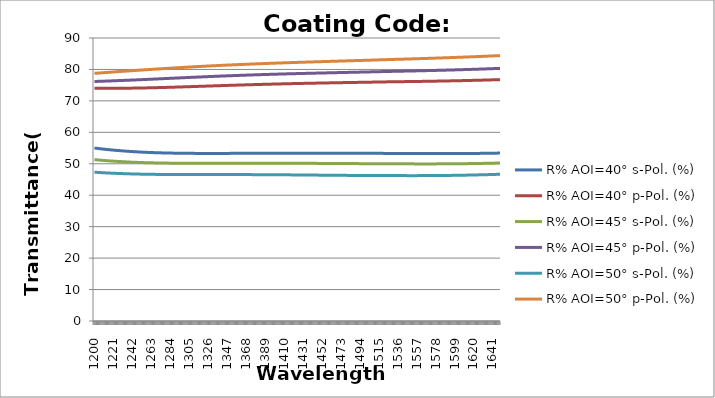
| Category | R% AOI=40° s-Pol. (%) | R% AOI=40° p-Pol. (%) | R% AOI=45° s-Pol. (%) | R% AOI=45° p-Pol. (%) | R% AOI=50° s-Pol. (%) | R% AOI=50° p-Pol. (%) |
|---|---|---|---|---|---|---|
| 1200.0 | 55.009 | 74.046 | 51.331 | 76.178 | 47.328 | 78.763 |
| 1201.0 | 54.972 | 74.042 | 51.303 | 76.186 | 47.308 | 78.783 |
| 1202.0 | 54.934 | 74.038 | 51.274 | 76.194 | 47.288 | 78.803 |
| 1203.0 | 54.898 | 74.034 | 51.247 | 76.203 | 47.268 | 78.823 |
| 1204.0 | 54.862 | 74.03 | 51.219 | 76.212 | 47.248 | 78.843 |
| 1205.0 | 54.827 | 74.027 | 51.193 | 76.221 | 47.23 | 78.864 |
| 1206.0 | 54.792 | 74.024 | 51.167 | 76.23 | 47.211 | 78.884 |
| 1207.0 | 54.758 | 74.021 | 51.141 | 76.239 | 47.194 | 78.904 |
| 1208.0 | 54.725 | 74.019 | 51.116 | 76.249 | 47.176 | 78.925 |
| 1209.0 | 54.692 | 74.016 | 51.092 | 76.259 | 47.159 | 78.945 |
| 1210.0 | 54.66 | 74.015 | 51.068 | 76.268 | 47.142 | 78.966 |
| 1211.0 | 54.629 | 74.013 | 51.044 | 76.279 | 47.126 | 78.986 |
| 1212.0 | 54.598 | 74.012 | 51.022 | 76.289 | 47.11 | 79.007 |
| 1213.0 | 54.567 | 74.011 | 50.999 | 76.299 | 47.095 | 79.028 |
| 1214.0 | 54.538 | 74.01 | 50.977 | 76.31 | 47.08 | 79.049 |
| 1215.0 | 54.508 | 74.01 | 50.956 | 76.321 | 47.066 | 79.07 |
| 1216.0 | 54.48 | 74.01 | 50.935 | 76.332 | 47.051 | 79.09 |
| 1217.0 | 54.452 | 74.01 | 50.914 | 76.343 | 47.038 | 79.111 |
| 1218.0 | 54.424 | 74.01 | 50.894 | 76.354 | 47.024 | 79.132 |
| 1219.0 | 54.397 | 74.011 | 50.875 | 76.365 | 47.011 | 79.153 |
| 1220.0 | 54.371 | 74.012 | 50.856 | 76.377 | 46.998 | 79.174 |
| 1221.0 | 54.345 | 74.013 | 50.837 | 76.388 | 46.986 | 79.195 |
| 1222.0 | 54.319 | 74.014 | 50.819 | 76.4 | 46.974 | 79.216 |
| 1223.0 | 54.294 | 74.016 | 50.801 | 76.412 | 46.962 | 79.238 |
| 1224.0 | 54.27 | 74.018 | 50.783 | 76.424 | 46.951 | 79.259 |
| 1225.0 | 54.246 | 74.02 | 50.766 | 76.436 | 46.94 | 79.28 |
| 1226.0 | 54.223 | 74.022 | 50.75 | 76.448 | 46.93 | 79.301 |
| 1227.0 | 54.2 | 74.025 | 50.734 | 76.461 | 46.919 | 79.322 |
| 1228.0 | 54.176 | 74.026 | 50.717 | 76.472 | 46.908 | 79.342 |
| 1229.0 | 54.152 | 74.027 | 50.699 | 76.483 | 46.896 | 79.361 |
| 1230.0 | 54.128 | 74.029 | 50.682 | 76.494 | 46.885 | 79.381 |
| 1231.0 | 54.105 | 74.03 | 50.666 | 76.504 | 46.873 | 79.4 |
| 1232.0 | 54.082 | 74.032 | 50.649 | 76.515 | 46.862 | 79.419 |
| 1233.0 | 54.06 | 74.034 | 50.633 | 76.526 | 46.852 | 79.439 |
| 1234.0 | 54.038 | 74.036 | 50.618 | 76.538 | 46.842 | 79.458 |
| 1235.0 | 54.017 | 74.038 | 50.602 | 76.549 | 46.832 | 79.477 |
| 1236.0 | 53.996 | 74.04 | 50.588 | 76.56 | 46.822 | 79.497 |
| 1237.0 | 53.975 | 74.043 | 50.573 | 76.572 | 46.812 | 79.516 |
| 1238.0 | 53.955 | 74.046 | 50.559 | 76.584 | 46.803 | 79.536 |
| 1239.0 | 53.935 | 74.049 | 50.545 | 76.595 | 46.794 | 79.555 |
| 1240.0 | 53.916 | 74.052 | 50.532 | 76.607 | 46.786 | 79.574 |
| 1241.0 | 53.897 | 74.055 | 50.519 | 76.619 | 46.777 | 79.594 |
| 1242.0 | 53.879 | 74.059 | 50.506 | 76.631 | 46.769 | 79.613 |
| 1243.0 | 53.861 | 74.063 | 50.493 | 76.643 | 46.761 | 79.632 |
| 1244.0 | 53.843 | 74.066 | 50.481 | 76.655 | 46.753 | 79.652 |
| 1245.0 | 53.826 | 74.071 | 50.469 | 76.667 | 46.746 | 79.671 |
| 1246.0 | 53.809 | 74.075 | 50.458 | 76.679 | 46.738 | 79.69 |
| 1247.0 | 53.792 | 74.079 | 50.447 | 76.691 | 46.731 | 79.709 |
| 1248.0 | 53.776 | 74.084 | 50.436 | 76.704 | 46.725 | 79.729 |
| 1249.0 | 53.76 | 74.088 | 50.425 | 76.716 | 46.718 | 79.748 |
| 1250.0 | 53.745 | 74.093 | 50.415 | 76.729 | 46.712 | 79.767 |
| 1251.0 | 53.73 | 74.098 | 50.405 | 76.741 | 46.705 | 79.786 |
| 1252.0 | 53.715 | 74.104 | 50.395 | 76.754 | 46.699 | 79.806 |
| 1253.0 | 53.701 | 74.109 | 50.385 | 76.766 | 46.694 | 79.825 |
| 1254.0 | 53.687 | 74.114 | 50.376 | 76.779 | 46.688 | 79.844 |
| 1255.0 | 53.673 | 74.12 | 50.367 | 76.792 | 46.683 | 79.863 |
| 1256.0 | 53.66 | 74.126 | 50.358 | 76.805 | 46.677 | 79.882 |
| 1257.0 | 53.647 | 74.132 | 50.35 | 76.818 | 46.672 | 79.901 |
| 1258.0 | 53.634 | 74.138 | 50.342 | 76.831 | 46.668 | 79.92 |
| 1259.0 | 53.622 | 74.144 | 50.334 | 76.844 | 46.663 | 79.939 |
| 1260.0 | 53.61 | 74.15 | 50.326 | 76.856 | 46.658 | 79.958 |
| 1261.0 | 53.598 | 74.156 | 50.318 | 76.87 | 46.654 | 79.977 |
| 1262.0 | 53.586 | 74.163 | 50.311 | 76.883 | 46.65 | 79.996 |
| 1263.0 | 53.575 | 74.169 | 50.304 | 76.896 | 46.646 | 80.014 |
| 1264.0 | 53.564 | 74.176 | 50.297 | 76.909 | 46.642 | 80.033 |
| 1265.0 | 53.554 | 74.183 | 50.29 | 76.922 | 46.638 | 80.052 |
| 1266.0 | 53.544 | 74.19 | 50.284 | 76.935 | 46.634 | 80.071 |
| 1267.0 | 53.534 | 74.197 | 50.278 | 76.948 | 46.631 | 80.089 |
| 1268.0 | 53.524 | 74.204 | 50.272 | 76.962 | 46.628 | 80.108 |
| 1269.0 | 53.514 | 74.211 | 50.266 | 76.975 | 46.624 | 80.126 |
| 1270.0 | 53.505 | 74.218 | 50.26 | 76.988 | 46.621 | 80.145 |
| 1271.0 | 53.496 | 74.226 | 50.255 | 77.002 | 46.618 | 80.163 |
| 1272.0 | 53.487 | 74.233 | 50.25 | 77.015 | 46.616 | 80.182 |
| 1273.0 | 53.479 | 74.241 | 50.245 | 77.028 | 46.613 | 80.2 |
| 1274.0 | 53.471 | 74.249 | 50.24 | 77.042 | 46.61 | 80.218 |
| 1275.0 | 53.463 | 74.256 | 50.236 | 77.055 | 46.608 | 80.237 |
| 1276.0 | 53.455 | 74.264 | 50.231 | 77.068 | 46.606 | 80.255 |
| 1277.0 | 53.448 | 74.272 | 50.227 | 77.082 | 46.604 | 80.273 |
| 1278.0 | 53.44 | 74.28 | 50.223 | 77.095 | 46.601 | 80.291 |
| 1279.0 | 53.433 | 74.288 | 50.219 | 77.108 | 46.599 | 80.309 |
| 1280.0 | 53.427 | 74.297 | 50.215 | 77.122 | 46.598 | 80.327 |
| 1281.0 | 53.42 | 74.305 | 50.211 | 77.135 | 46.596 | 80.345 |
| 1282.0 | 53.414 | 74.313 | 50.208 | 77.149 | 46.594 | 80.363 |
| 1283.0 | 53.408 | 74.322 | 50.204 | 77.162 | 46.592 | 80.381 |
| 1284.0 | 53.402 | 74.33 | 50.201 | 77.175 | 46.591 | 80.399 |
| 1285.0 | 53.396 | 74.339 | 50.198 | 77.189 | 46.589 | 80.416 |
| 1286.0 | 53.39 | 74.347 | 50.195 | 77.202 | 46.588 | 80.434 |
| 1287.0 | 53.385 | 74.356 | 50.192 | 77.216 | 46.587 | 80.452 |
| 1288.0 | 53.38 | 74.365 | 50.19 | 77.229 | 46.585 | 80.469 |
| 1289.0 | 53.375 | 74.373 | 50.187 | 77.242 | 46.584 | 80.487 |
| 1290.0 | 53.37 | 74.382 | 50.185 | 77.256 | 46.583 | 80.504 |
| 1291.0 | 53.366 | 74.391 | 50.183 | 77.269 | 46.582 | 80.521 |
| 1292.0 | 53.361 | 74.4 | 50.18 | 77.282 | 46.581 | 80.539 |
| 1293.0 | 53.357 | 74.409 | 50.178 | 77.296 | 46.58 | 80.556 |
| 1294.0 | 53.353 | 74.418 | 50.176 | 77.309 | 46.579 | 80.573 |
| 1295.0 | 53.349 | 74.427 | 50.175 | 77.322 | 46.579 | 80.59 |
| 1296.0 | 53.346 | 74.436 | 50.173 | 77.335 | 46.578 | 80.607 |
| 1297.0 | 53.342 | 74.445 | 50.172 | 77.349 | 46.577 | 80.624 |
| 1298.0 | 53.339 | 74.454 | 50.17 | 77.362 | 46.577 | 80.641 |
| 1299.0 | 53.335 | 74.464 | 50.169 | 77.375 | 46.576 | 80.658 |
| 1300.0 | 53.332 | 74.473 | 50.167 | 77.388 | 46.576 | 80.674 |
| 1301.0 | 53.329 | 74.482 | 50.166 | 77.401 | 46.575 | 80.691 |
| 1302.0 | 53.327 | 74.491 | 50.165 | 77.415 | 46.575 | 80.708 |
| 1303.0 | 53.324 | 74.501 | 50.164 | 77.428 | 46.574 | 80.724 |
| 1304.0 | 53.322 | 74.51 | 50.163 | 77.441 | 46.574 | 80.741 |
| 1305.0 | 53.319 | 74.52 | 50.162 | 77.454 | 46.574 | 80.757 |
| 1306.0 | 53.317 | 74.529 | 50.161 | 77.467 | 46.573 | 80.773 |
| 1307.0 | 53.315 | 74.538 | 50.161 | 77.48 | 46.573 | 80.79 |
| 1308.0 | 53.313 | 74.548 | 50.16 | 77.493 | 46.573 | 80.806 |
| 1309.0 | 53.311 | 74.557 | 50.16 | 77.506 | 46.573 | 80.822 |
| 1310.0 | 53.309 | 74.567 | 50.159 | 77.519 | 46.572 | 80.838 |
| 1311.0 | 53.308 | 74.576 | 50.159 | 77.531 | 46.572 | 80.854 |
| 1312.0 | 53.306 | 74.586 | 50.158 | 77.544 | 46.572 | 80.87 |
| 1313.0 | 53.305 | 74.595 | 50.158 | 77.557 | 46.572 | 80.886 |
| 1314.0 | 53.303 | 74.605 | 50.158 | 77.57 | 46.572 | 80.901 |
| 1315.0 | 53.302 | 74.614 | 50.158 | 77.582 | 46.572 | 80.917 |
| 1316.0 | 53.301 | 74.624 | 50.158 | 77.595 | 46.572 | 80.933 |
| 1317.0 | 53.3 | 74.634 | 50.158 | 77.608 | 46.572 | 80.948 |
| 1318.0 | 53.299 | 74.643 | 50.158 | 77.62 | 46.572 | 80.964 |
| 1319.0 | 53.298 | 74.653 | 50.158 | 77.633 | 46.572 | 80.979 |
| 1320.0 | 53.298 | 74.662 | 50.158 | 77.646 | 46.572 | 80.994 |
| 1321.0 | 53.297 | 74.672 | 50.158 | 77.658 | 46.572 | 81.01 |
| 1322.0 | 53.297 | 74.681 | 50.158 | 77.67 | 46.572 | 81.025 |
| 1323.0 | 53.296 | 74.691 | 50.158 | 77.683 | 46.572 | 81.04 |
| 1324.0 | 53.296 | 74.701 | 50.158 | 77.695 | 46.572 | 81.055 |
| 1325.0 | 53.296 | 74.71 | 50.159 | 77.708 | 46.572 | 81.07 |
| 1326.0 | 53.295 | 74.72 | 50.159 | 77.72 | 46.572 | 81.085 |
| 1327.0 | 53.295 | 74.729 | 50.159 | 77.732 | 46.572 | 81.1 |
| 1328.0 | 53.295 | 74.739 | 50.16 | 77.744 | 46.572 | 81.114 |
| 1329.0 | 53.295 | 74.748 | 50.16 | 77.756 | 46.572 | 81.129 |
| 1330.0 | 53.295 | 74.758 | 50.16 | 77.768 | 46.572 | 81.144 |
| 1331.0 | 53.295 | 74.768 | 50.161 | 77.78 | 46.571 | 81.158 |
| 1332.0 | 53.296 | 74.777 | 50.162 | 77.792 | 46.571 | 81.173 |
| 1333.0 | 53.296 | 74.786 | 50.162 | 77.804 | 46.571 | 81.187 |
| 1334.0 | 53.296 | 74.796 | 50.162 | 77.816 | 46.571 | 81.201 |
| 1335.0 | 53.297 | 74.806 | 50.163 | 77.828 | 46.571 | 81.216 |
| 1336.0 | 53.297 | 74.815 | 50.164 | 77.84 | 46.571 | 81.23 |
| 1337.0 | 53.298 | 74.824 | 50.164 | 77.852 | 46.571 | 81.244 |
| 1338.0 | 53.298 | 74.834 | 50.165 | 77.863 | 46.571 | 81.258 |
| 1339.0 | 53.299 | 74.843 | 50.165 | 77.875 | 46.571 | 81.272 |
| 1340.0 | 53.299 | 74.853 | 50.166 | 77.886 | 46.57 | 81.286 |
| 1341.0 | 53.3 | 74.862 | 50.167 | 77.898 | 46.57 | 81.299 |
| 1342.0 | 53.301 | 74.871 | 50.167 | 77.909 | 46.57 | 81.313 |
| 1343.0 | 53.301 | 74.881 | 50.168 | 77.921 | 46.57 | 81.327 |
| 1344.0 | 53.302 | 74.89 | 50.168 | 77.932 | 46.57 | 81.34 |
| 1345.0 | 53.303 | 74.899 | 50.169 | 77.944 | 46.569 | 81.354 |
| 1346.0 | 53.304 | 74.909 | 50.17 | 77.955 | 46.569 | 81.367 |
| 1347.0 | 53.305 | 74.918 | 50.17 | 77.966 | 46.569 | 81.381 |
| 1348.0 | 53.306 | 74.927 | 50.171 | 77.977 | 46.568 | 81.394 |
| 1349.0 | 53.307 | 74.936 | 50.172 | 77.988 | 46.568 | 81.407 |
| 1350.0 | 53.308 | 74.945 | 50.172 | 77.999 | 46.568 | 81.42 |
| 1351.0 | 53.309 | 74.954 | 50.173 | 78.01 | 46.567 | 81.433 |
| 1352.0 | 53.31 | 74.964 | 50.174 | 78.021 | 46.567 | 81.446 |
| 1353.0 | 53.311 | 74.973 | 50.174 | 78.032 | 46.566 | 81.459 |
| 1354.0 | 53.312 | 74.982 | 50.175 | 78.043 | 46.566 | 81.472 |
| 1355.0 | 53.313 | 74.991 | 50.175 | 78.054 | 46.565 | 81.485 |
| 1356.0 | 53.314 | 75 | 50.176 | 78.065 | 46.565 | 81.498 |
| 1357.0 | 53.315 | 75.009 | 50.176 | 78.075 | 46.564 | 81.51 |
| 1358.0 | 53.316 | 75.018 | 50.177 | 78.086 | 46.564 | 81.523 |
| 1359.0 | 53.317 | 75.026 | 50.178 | 78.096 | 46.563 | 81.536 |
| 1360.0 | 53.318 | 75.035 | 50.178 | 78.107 | 46.562 | 81.548 |
| 1361.0 | 53.32 | 75.044 | 50.179 | 78.118 | 46.562 | 81.561 |
| 1362.0 | 53.321 | 75.053 | 50.179 | 78.128 | 46.561 | 81.573 |
| 1363.0 | 53.322 | 75.062 | 50.18 | 78.138 | 46.56 | 81.585 |
| 1364.0 | 53.323 | 75.07 | 50.18 | 78.149 | 46.559 | 81.598 |
| 1365.0 | 53.324 | 75.079 | 50.18 | 78.159 | 46.558 | 81.61 |
| 1366.0 | 53.326 | 75.088 | 50.181 | 78.169 | 46.558 | 81.622 |
| 1367.0 | 53.327 | 75.096 | 50.181 | 78.179 | 46.557 | 81.634 |
| 1368.0 | 53.328 | 75.105 | 50.182 | 78.189 | 46.556 | 81.646 |
| 1369.0 | 53.329 | 75.113 | 50.182 | 78.199 | 46.555 | 81.658 |
| 1370.0 | 53.33 | 75.122 | 50.182 | 78.209 | 46.554 | 81.67 |
| 1371.0 | 53.332 | 75.13 | 50.183 | 78.219 | 46.553 | 81.681 |
| 1372.0 | 53.333 | 75.139 | 50.183 | 78.229 | 46.552 | 81.693 |
| 1373.0 | 53.334 | 75.147 | 50.183 | 78.239 | 46.551 | 81.705 |
| 1374.0 | 53.335 | 75.156 | 50.184 | 78.249 | 46.55 | 81.716 |
| 1375.0 | 53.336 | 75.164 | 50.184 | 78.258 | 46.548 | 81.728 |
| 1376.0 | 53.338 | 75.172 | 50.184 | 78.268 | 46.547 | 81.74 |
| 1377.0 | 53.339 | 75.18 | 50.184 | 78.278 | 46.546 | 81.751 |
| 1378.0 | 53.34 | 75.188 | 50.184 | 78.287 | 46.545 | 81.762 |
| 1379.0 | 53.341 | 75.197 | 50.184 | 78.297 | 46.544 | 81.774 |
| 1380.0 | 53.342 | 75.205 | 50.185 | 78.306 | 46.542 | 81.785 |
| 1381.0 | 53.343 | 75.213 | 50.185 | 78.316 | 46.541 | 81.796 |
| 1382.0 | 53.344 | 75.221 | 50.185 | 78.325 | 46.54 | 81.807 |
| 1383.0 | 53.346 | 75.229 | 50.185 | 78.334 | 46.538 | 81.818 |
| 1384.0 | 53.347 | 75.237 | 50.185 | 78.343 | 46.537 | 81.83 |
| 1385.0 | 53.348 | 75.245 | 50.185 | 78.353 | 46.535 | 81.84 |
| 1386.0 | 53.349 | 75.252 | 50.185 | 78.362 | 46.534 | 81.852 |
| 1387.0 | 53.35 | 75.26 | 50.185 | 78.371 | 46.532 | 81.862 |
| 1388.0 | 53.351 | 75.268 | 50.184 | 78.38 | 46.53 | 81.873 |
| 1389.0 | 53.352 | 75.276 | 50.184 | 78.389 | 46.529 | 81.884 |
| 1390.0 | 53.353 | 75.284 | 50.184 | 78.398 | 46.527 | 81.895 |
| 1391.0 | 53.354 | 75.291 | 50.184 | 78.407 | 46.526 | 81.905 |
| 1392.0 | 53.355 | 75.299 | 50.184 | 78.416 | 46.524 | 81.916 |
| 1393.0 | 53.356 | 75.306 | 50.183 | 78.424 | 46.522 | 81.927 |
| 1394.0 | 53.357 | 75.314 | 50.183 | 78.433 | 46.52 | 81.937 |
| 1395.0 | 53.358 | 75.321 | 50.183 | 78.442 | 46.518 | 81.948 |
| 1396.0 | 53.358 | 75.329 | 50.182 | 78.45 | 46.517 | 81.958 |
| 1397.0 | 53.359 | 75.336 | 50.182 | 78.459 | 46.515 | 81.969 |
| 1398.0 | 53.36 | 75.344 | 50.182 | 78.468 | 46.513 | 81.979 |
| 1399.0 | 53.361 | 75.351 | 50.181 | 78.476 | 46.511 | 81.989 |
| 1400.0 | 53.362 | 75.358 | 50.181 | 78.485 | 46.509 | 82 |
| 1401.0 | 53.362 | 75.365 | 50.18 | 78.493 | 46.507 | 82.01 |
| 1402.0 | 53.363 | 75.372 | 50.18 | 78.502 | 46.505 | 82.02 |
| 1403.0 | 53.364 | 75.38 | 50.179 | 78.51 | 46.503 | 82.03 |
| 1404.0 | 53.364 | 75.387 | 50.178 | 78.518 | 46.501 | 82.04 |
| 1405.0 | 53.365 | 75.394 | 50.178 | 78.526 | 46.499 | 82.05 |
| 1406.0 | 53.366 | 75.401 | 50.177 | 78.535 | 46.497 | 82.06 |
| 1407.0 | 53.366 | 75.408 | 50.176 | 78.543 | 46.494 | 82.07 |
| 1408.0 | 53.367 | 75.415 | 50.176 | 78.551 | 46.492 | 82.08 |
| 1409.0 | 53.368 | 75.422 | 50.175 | 78.559 | 46.49 | 82.09 |
| 1410.0 | 53.368 | 75.429 | 50.174 | 78.567 | 46.488 | 82.1 |
| 1411.0 | 53.368 | 75.435 | 50.173 | 78.575 | 46.486 | 82.11 |
| 1412.0 | 53.369 | 75.442 | 50.172 | 78.583 | 46.483 | 82.119 |
| 1413.0 | 53.369 | 75.449 | 50.172 | 78.591 | 46.481 | 82.129 |
| 1414.0 | 53.37 | 75.456 | 50.171 | 78.599 | 46.479 | 82.139 |
| 1415.0 | 53.37 | 75.462 | 50.17 | 78.606 | 46.476 | 82.148 |
| 1416.0 | 53.371 | 75.469 | 50.169 | 78.614 | 46.474 | 82.158 |
| 1417.0 | 53.371 | 75.476 | 50.168 | 78.622 | 46.472 | 82.168 |
| 1418.0 | 53.371 | 75.482 | 50.167 | 78.63 | 46.469 | 82.177 |
| 1419.0 | 53.372 | 75.489 | 50.166 | 78.638 | 46.467 | 82.187 |
| 1420.0 | 53.372 | 75.495 | 50.165 | 78.645 | 46.464 | 82.196 |
| 1421.0 | 53.372 | 75.502 | 50.164 | 78.653 | 46.462 | 82.206 |
| 1422.0 | 53.372 | 75.508 | 50.162 | 78.66 | 46.46 | 82.215 |
| 1423.0 | 53.372 | 75.514 | 50.161 | 78.668 | 46.457 | 82.225 |
| 1424.0 | 53.372 | 75.521 | 50.16 | 78.675 | 46.454 | 82.234 |
| 1425.0 | 53.372 | 75.527 | 50.159 | 78.683 | 46.452 | 82.243 |
| 1426.0 | 53.373 | 75.533 | 50.158 | 78.69 | 46.449 | 82.253 |
| 1427.0 | 53.373 | 75.54 | 50.156 | 78.698 | 46.447 | 82.262 |
| 1428.0 | 53.373 | 75.546 | 50.155 | 78.705 | 46.444 | 82.271 |
| 1429.0 | 53.373 | 75.552 | 50.154 | 78.712 | 46.442 | 82.28 |
| 1430.0 | 53.373 | 75.558 | 50.152 | 78.72 | 46.439 | 82.29 |
| 1431.0 | 53.373 | 75.564 | 50.151 | 78.727 | 46.436 | 82.299 |
| 1432.0 | 53.372 | 75.57 | 50.15 | 78.734 | 46.434 | 82.308 |
| 1433.0 | 53.372 | 75.576 | 50.148 | 78.742 | 46.431 | 82.317 |
| 1434.0 | 53.372 | 75.582 | 50.147 | 78.749 | 46.429 | 82.326 |
| 1435.0 | 53.372 | 75.588 | 50.145 | 78.756 | 46.426 | 82.335 |
| 1436.0 | 53.372 | 75.594 | 50.144 | 78.763 | 46.423 | 82.344 |
| 1437.0 | 53.372 | 75.6 | 50.142 | 78.77 | 46.421 | 82.354 |
| 1438.0 | 53.372 | 75.606 | 50.141 | 78.777 | 46.418 | 82.362 |
| 1439.0 | 53.371 | 75.612 | 50.14 | 78.784 | 46.415 | 82.372 |
| 1440.0 | 53.371 | 75.617 | 50.138 | 78.791 | 46.413 | 82.38 |
| 1441.0 | 53.371 | 75.623 | 50.136 | 78.798 | 46.41 | 82.389 |
| 1442.0 | 53.37 | 75.629 | 50.135 | 78.805 | 46.407 | 82.398 |
| 1443.0 | 53.37 | 75.635 | 50.133 | 78.812 | 46.405 | 82.407 |
| 1444.0 | 53.37 | 75.64 | 50.132 | 78.819 | 46.402 | 82.416 |
| 1445.0 | 53.369 | 75.646 | 50.13 | 78.826 | 46.399 | 82.425 |
| 1446.0 | 53.369 | 75.652 | 50.128 | 78.833 | 46.397 | 82.434 |
| 1447.0 | 53.368 | 75.657 | 50.127 | 78.84 | 46.394 | 82.443 |
| 1448.0 | 53.368 | 75.663 | 50.125 | 78.847 | 46.391 | 82.452 |
| 1449.0 | 53.367 | 75.668 | 50.123 | 78.854 | 46.389 | 82.46 |
| 1450.0 | 53.367 | 75.674 | 50.122 | 78.86 | 46.386 | 82.469 |
| 1451.0 | 53.366 | 75.679 | 50.12 | 78.867 | 46.383 | 82.478 |
| 1452.0 | 53.366 | 75.685 | 50.118 | 78.874 | 46.38 | 82.487 |
| 1453.0 | 53.365 | 75.69 | 50.117 | 78.881 | 46.378 | 82.496 |
| 1454.0 | 53.364 | 75.696 | 50.115 | 78.887 | 46.375 | 82.504 |
| 1455.0 | 53.364 | 75.701 | 50.113 | 78.894 | 46.372 | 82.513 |
| 1456.0 | 53.363 | 75.706 | 50.111 | 78.901 | 46.37 | 82.522 |
| 1457.0 | 53.362 | 75.712 | 50.11 | 78.907 | 46.367 | 82.531 |
| 1458.0 | 53.362 | 75.717 | 50.108 | 78.914 | 46.365 | 82.54 |
| 1459.0 | 53.361 | 75.722 | 50.106 | 78.921 | 46.362 | 82.548 |
| 1460.0 | 53.36 | 75.728 | 50.104 | 78.927 | 46.359 | 82.557 |
| 1461.0 | 53.36 | 75.733 | 50.103 | 78.934 | 46.357 | 82.566 |
| 1462.0 | 53.359 | 75.738 | 50.101 | 78.941 | 46.354 | 82.574 |
| 1463.0 | 53.358 | 75.743 | 50.099 | 78.947 | 46.352 | 82.583 |
| 1464.0 | 53.357 | 75.749 | 50.097 | 78.954 | 46.349 | 82.592 |
| 1465.0 | 53.357 | 75.754 | 50.095 | 78.96 | 46.347 | 82.6 |
| 1466.0 | 53.356 | 75.759 | 50.094 | 78.967 | 46.344 | 82.609 |
| 1467.0 | 53.355 | 75.764 | 50.092 | 78.974 | 46.342 | 82.618 |
| 1468.0 | 53.354 | 75.769 | 50.09 | 78.98 | 46.339 | 82.627 |
| 1469.0 | 53.353 | 75.774 | 50.088 | 78.987 | 46.337 | 82.635 |
| 1470.0 | 53.352 | 75.779 | 50.086 | 78.993 | 46.334 | 82.644 |
| 1471.0 | 53.352 | 75.784 | 50.085 | 79 | 46.332 | 82.653 |
| 1472.0 | 53.351 | 75.79 | 50.083 | 79.006 | 46.329 | 82.661 |
| 1473.0 | 53.35 | 75.795 | 50.081 | 79.013 | 46.327 | 82.67 |
| 1474.0 | 53.349 | 75.8 | 50.079 | 79.019 | 46.324 | 82.679 |
| 1475.0 | 53.348 | 75.805 | 50.078 | 79.026 | 46.322 | 82.687 |
| 1476.0 | 53.347 | 75.81 | 50.076 | 79.032 | 46.32 | 82.696 |
| 1477.0 | 53.346 | 75.815 | 50.074 | 79.039 | 46.318 | 82.705 |
| 1478.0 | 53.345 | 75.82 | 50.072 | 79.045 | 46.315 | 82.713 |
| 1479.0 | 53.344 | 75.825 | 50.07 | 79.052 | 46.313 | 82.722 |
| 1480.0 | 53.343 | 75.83 | 50.069 | 79.058 | 46.311 | 82.731 |
| 1481.0 | 53.342 | 75.835 | 50.067 | 79.065 | 46.309 | 82.74 |
| 1482.0 | 53.341 | 75.84 | 50.065 | 79.071 | 46.306 | 82.748 |
| 1483.0 | 53.34 | 75.845 | 50.064 | 79.078 | 46.304 | 82.757 |
| 1484.0 | 53.339 | 75.85 | 50.062 | 79.084 | 46.302 | 82.766 |
| 1485.0 | 53.338 | 75.855 | 50.06 | 79.091 | 46.3 | 82.774 |
| 1486.0 | 53.337 | 75.86 | 50.058 | 79.097 | 46.298 | 82.783 |
| 1487.0 | 53.336 | 75.864 | 50.057 | 79.104 | 46.296 | 82.792 |
| 1488.0 | 53.335 | 75.869 | 50.055 | 79.11 | 46.294 | 82.801 |
| 1489.0 | 53.334 | 75.874 | 50.054 | 79.117 | 46.292 | 82.809 |
| 1490.0 | 53.333 | 75.879 | 50.052 | 79.124 | 46.29 | 82.818 |
| 1491.0 | 53.332 | 75.884 | 50.05 | 79.13 | 46.288 | 82.827 |
| 1492.0 | 53.331 | 75.889 | 50.049 | 79.137 | 46.287 | 82.836 |
| 1493.0 | 53.33 | 75.894 | 50.047 | 79.143 | 46.285 | 82.844 |
| 1494.0 | 53.329 | 75.899 | 50.046 | 79.15 | 46.283 | 82.853 |
| 1495.0 | 53.328 | 75.904 | 50.044 | 79.156 | 46.281 | 82.862 |
| 1496.0 | 53.328 | 75.909 | 50.043 | 79.163 | 46.28 | 82.871 |
| 1497.0 | 53.326 | 75.914 | 50.041 | 79.169 | 46.278 | 82.88 |
| 1498.0 | 53.326 | 75.918 | 50.04 | 79.176 | 46.277 | 82.889 |
| 1499.0 | 53.325 | 75.923 | 50.038 | 79.182 | 46.275 | 82.898 |
| 1500.0 | 53.324 | 75.928 | 50.037 | 79.189 | 46.274 | 82.906 |
| 1501.0 | 53.323 | 75.933 | 50.035 | 79.196 | 46.272 | 82.915 |
| 1502.0 | 53.322 | 75.938 | 50.034 | 79.202 | 46.271 | 82.924 |
| 1503.0 | 53.321 | 75.943 | 50.033 | 79.209 | 46.269 | 82.933 |
| 1504.0 | 53.32 | 75.948 | 50.032 | 79.216 | 46.268 | 82.942 |
| 1505.0 | 53.319 | 75.953 | 50.03 | 79.222 | 46.267 | 82.951 |
| 1506.0 | 53.318 | 75.958 | 50.029 | 79.229 | 46.266 | 82.96 |
| 1507.0 | 53.317 | 75.963 | 50.028 | 79.236 | 46.264 | 82.969 |
| 1508.0 | 53.316 | 75.968 | 50.026 | 79.242 | 46.263 | 82.978 |
| 1509.0 | 53.316 | 75.973 | 50.025 | 79.249 | 46.262 | 82.987 |
| 1510.0 | 53.315 | 75.978 | 50.024 | 79.256 | 46.261 | 82.996 |
| 1511.0 | 53.314 | 75.983 | 50.023 | 79.262 | 46.26 | 83.005 |
| 1512.0 | 53.313 | 75.988 | 50.022 | 79.269 | 46.259 | 83.014 |
| 1513.0 | 53.312 | 75.992 | 50.021 | 79.276 | 46.258 | 83.024 |
| 1514.0 | 53.312 | 75.998 | 50.02 | 79.283 | 46.258 | 83.033 |
| 1515.0 | 53.311 | 76.003 | 50.019 | 79.29 | 46.257 | 83.042 |
| 1516.0 | 53.31 | 76.008 | 50.018 | 79.296 | 46.256 | 83.051 |
| 1517.0 | 53.309 | 76.013 | 50.017 | 79.303 | 46.256 | 83.06 |
| 1518.0 | 53.309 | 76.018 | 50.016 | 79.31 | 46.255 | 83.069 |
| 1519.0 | 53.308 | 76.023 | 50.016 | 79.317 | 46.254 | 83.079 |
| 1520.0 | 53.307 | 76.028 | 50.015 | 79.324 | 46.254 | 83.088 |
| 1521.0 | 53.307 | 76.033 | 50.014 | 79.331 | 46.254 | 83.097 |
| 1522.0 | 53.306 | 76.038 | 50.014 | 79.338 | 46.253 | 83.107 |
| 1523.0 | 53.305 | 76.043 | 50.013 | 79.345 | 46.253 | 83.116 |
| 1524.0 | 53.305 | 76.048 | 50.012 | 79.352 | 46.253 | 83.125 |
| 1525.0 | 53.304 | 76.053 | 50.012 | 79.359 | 46.253 | 83.135 |
| 1526.0 | 53.304 | 76.058 | 50.011 | 79.366 | 46.253 | 83.144 |
| 1527.0 | 53.303 | 76.064 | 50.011 | 79.373 | 46.253 | 83.154 |
| 1528.0 | 53.302 | 76.068 | 50.01 | 79.379 | 46.252 | 83.162 |
| 1529.0 | 53.3 | 76.072 | 50.007 | 79.385 | 46.25 | 83.17 |
| 1530.0 | 53.297 | 76.075 | 50.005 | 79.39 | 46.248 | 83.178 |
| 1531.0 | 53.295 | 76.079 | 50.003 | 79.396 | 46.247 | 83.186 |
| 1532.0 | 53.293 | 76.082 | 50.001 | 79.402 | 46.246 | 83.194 |
| 1533.0 | 53.291 | 76.086 | 49.999 | 79.407 | 46.244 | 83.202 |
| 1534.0 | 53.288 | 76.09 | 49.997 | 79.413 | 46.243 | 83.21 |
| 1535.0 | 53.286 | 76.093 | 49.995 | 79.419 | 46.241 | 83.219 |
| 1536.0 | 53.284 | 76.097 | 49.993 | 79.424 | 46.24 | 83.227 |
| 1537.0 | 53.282 | 76.1 | 49.991 | 79.43 | 46.239 | 83.235 |
| 1538.0 | 53.28 | 76.104 | 49.99 | 79.436 | 46.238 | 83.243 |
| 1539.0 | 53.278 | 76.108 | 49.988 | 79.442 | 46.237 | 83.252 |
| 1540.0 | 53.276 | 76.112 | 49.986 | 79.447 | 46.236 | 83.26 |
| 1541.0 | 53.274 | 76.116 | 49.984 | 79.453 | 46.235 | 83.268 |
| 1542.0 | 53.272 | 76.119 | 49.983 | 79.459 | 46.234 | 83.276 |
| 1543.0 | 53.27 | 76.123 | 49.981 | 79.465 | 46.234 | 83.285 |
| 1544.0 | 53.269 | 76.127 | 49.98 | 79.471 | 46.233 | 83.293 |
| 1545.0 | 53.267 | 76.131 | 49.978 | 79.477 | 46.232 | 83.302 |
| 1546.0 | 53.265 | 76.135 | 49.977 | 79.483 | 46.232 | 83.31 |
| 1547.0 | 53.263 | 76.139 | 49.976 | 79.489 | 46.232 | 83.319 |
| 1548.0 | 53.262 | 76.143 | 49.975 | 79.495 | 46.231 | 83.327 |
| 1549.0 | 53.26 | 76.147 | 49.974 | 79.501 | 46.231 | 83.336 |
| 1550.0 | 53.259 | 76.151 | 49.972 | 79.507 | 46.231 | 83.344 |
| 1551.0 | 53.257 | 76.155 | 49.971 | 79.514 | 46.23 | 83.353 |
| 1552.0 | 53.256 | 76.159 | 49.97 | 79.52 | 46.23 | 83.362 |
| 1553.0 | 53.254 | 76.163 | 49.969 | 79.526 | 46.23 | 83.37 |
| 1554.0 | 53.253 | 76.167 | 49.968 | 79.532 | 46.231 | 83.379 |
| 1555.0 | 53.251 | 76.171 | 49.968 | 79.539 | 46.231 | 83.388 |
| 1556.0 | 53.25 | 76.176 | 49.967 | 79.545 | 46.231 | 83.397 |
| 1557.0 | 53.249 | 76.18 | 49.966 | 79.551 | 46.231 | 83.406 |
| 1558.0 | 53.247 | 76.184 | 49.966 | 79.558 | 46.232 | 83.414 |
| 1559.0 | 53.246 | 76.188 | 49.965 | 79.564 | 46.232 | 83.423 |
| 1560.0 | 53.245 | 76.193 | 49.965 | 79.571 | 46.233 | 83.432 |
| 1561.0 | 53.244 | 76.197 | 49.964 | 79.577 | 46.234 | 83.441 |
| 1562.0 | 53.243 | 76.202 | 49.964 | 79.584 | 46.234 | 83.45 |
| 1563.0 | 53.242 | 76.206 | 49.964 | 79.59 | 46.235 | 83.459 |
| 1564.0 | 53.241 | 76.21 | 49.963 | 79.597 | 46.236 | 83.468 |
| 1565.0 | 53.24 | 76.215 | 49.963 | 79.604 | 46.237 | 83.478 |
| 1566.0 | 53.239 | 76.22 | 49.963 | 79.611 | 46.238 | 83.487 |
| 1567.0 | 53.238 | 76.224 | 49.963 | 79.617 | 46.239 | 83.496 |
| 1568.0 | 53.238 | 76.229 | 49.963 | 79.624 | 46.241 | 83.505 |
| 1569.0 | 53.237 | 76.233 | 49.963 | 79.631 | 46.242 | 83.514 |
| 1570.0 | 53.236 | 76.238 | 49.963 | 79.638 | 46.244 | 83.524 |
| 1571.0 | 53.236 | 76.243 | 49.964 | 79.645 | 46.245 | 83.533 |
| 1572.0 | 53.235 | 76.248 | 49.964 | 79.652 | 46.247 | 83.543 |
| 1573.0 | 53.235 | 76.252 | 49.964 | 79.659 | 46.248 | 83.552 |
| 1574.0 | 53.234 | 76.257 | 49.965 | 79.666 | 46.25 | 83.562 |
| 1575.0 | 53.234 | 76.262 | 49.965 | 79.673 | 46.252 | 83.571 |
| 1576.0 | 53.234 | 76.267 | 49.966 | 79.68 | 46.254 | 83.581 |
| 1577.0 | 53.234 | 76.272 | 49.967 | 79.688 | 46.256 | 83.59 |
| 1578.0 | 53.234 | 76.277 | 49.968 | 79.695 | 46.258 | 83.6 |
| 1579.0 | 53.233 | 76.282 | 49.968 | 79.702 | 46.26 | 83.61 |
| 1580.0 | 53.233 | 76.287 | 49.969 | 79.71 | 46.263 | 83.619 |
| 1581.0 | 53.233 | 76.292 | 49.97 | 79.717 | 46.265 | 83.629 |
| 1582.0 | 53.233 | 76.298 | 49.971 | 79.724 | 46.268 | 83.639 |
| 1583.0 | 53.234 | 76.303 | 49.972 | 79.732 | 46.27 | 83.649 |
| 1584.0 | 53.234 | 76.308 | 49.974 | 79.739 | 46.273 | 83.659 |
| 1585.0 | 53.234 | 76.314 | 49.975 | 79.747 | 46.276 | 83.669 |
| 1586.0 | 53.234 | 76.319 | 49.976 | 79.754 | 46.279 | 83.679 |
| 1587.0 | 53.235 | 76.324 | 49.978 | 79.762 | 46.282 | 83.689 |
| 1588.0 | 53.235 | 76.33 | 49.98 | 79.77 | 46.285 | 83.699 |
| 1589.0 | 53.236 | 76.335 | 49.981 | 79.778 | 46.288 | 83.709 |
| 1590.0 | 53.236 | 76.341 | 49.983 | 79.785 | 46.291 | 83.719 |
| 1591.0 | 53.237 | 76.346 | 49.985 | 79.793 | 46.294 | 83.729 |
| 1592.0 | 53.237 | 76.352 | 49.986 | 79.801 | 46.298 | 83.739 |
| 1593.0 | 53.238 | 76.358 | 49.988 | 79.809 | 46.301 | 83.75 |
| 1594.0 | 53.239 | 76.363 | 49.99 | 79.817 | 46.305 | 83.76 |
| 1595.0 | 53.24 | 76.369 | 49.993 | 79.825 | 46.309 | 83.77 |
| 1596.0 | 53.241 | 76.375 | 49.995 | 79.833 | 46.313 | 83.781 |
| 1597.0 | 53.242 | 76.381 | 49.997 | 79.842 | 46.317 | 83.791 |
| 1598.0 | 53.243 | 76.387 | 50 | 79.85 | 46.321 | 83.802 |
| 1599.0 | 53.244 | 76.393 | 50.002 | 79.858 | 46.325 | 83.812 |
| 1600.0 | 53.245 | 76.399 | 50.004 | 79.866 | 46.329 | 83.823 |
| 1601.0 | 53.247 | 76.405 | 50.007 | 79.875 | 46.333 | 83.833 |
| 1602.0 | 53.248 | 76.411 | 50.01 | 79.883 | 46.338 | 83.844 |
| 1603.0 | 53.25 | 76.417 | 50.013 | 79.891 | 46.342 | 83.855 |
| 1604.0 | 53.251 | 76.423 | 50.016 | 79.9 | 46.347 | 83.865 |
| 1605.0 | 53.253 | 76.43 | 50.018 | 79.908 | 46.352 | 83.876 |
| 1606.0 | 53.254 | 76.436 | 50.022 | 79.917 | 46.356 | 83.887 |
| 1607.0 | 53.256 | 76.442 | 50.025 | 79.926 | 46.362 | 83.898 |
| 1608.0 | 53.258 | 76.449 | 50.028 | 79.934 | 46.366 | 83.909 |
| 1609.0 | 53.26 | 76.455 | 50.031 | 79.943 | 46.372 | 83.92 |
| 1610.0 | 53.262 | 76.462 | 50.035 | 79.952 | 46.377 | 83.931 |
| 1611.0 | 53.264 | 76.468 | 50.038 | 79.961 | 46.382 | 83.942 |
| 1612.0 | 53.266 | 76.475 | 50.042 | 79.97 | 46.388 | 83.953 |
| 1613.0 | 53.268 | 76.482 | 50.046 | 79.979 | 46.393 | 83.964 |
| 1614.0 | 53.27 | 76.488 | 50.049 | 79.988 | 46.399 | 83.975 |
| 1615.0 | 53.273 | 76.495 | 50.053 | 79.997 | 46.405 | 83.987 |
| 1616.0 | 53.275 | 76.502 | 50.057 | 80.006 | 46.41 | 83.998 |
| 1617.0 | 53.278 | 76.509 | 50.061 | 80.015 | 46.416 | 84.009 |
| 1618.0 | 53.28 | 76.516 | 50.065 | 80.024 | 46.423 | 84.021 |
| 1619.0 | 53.283 | 76.523 | 50.07 | 80.034 | 46.429 | 84.032 |
| 1620.0 | 53.286 | 76.53 | 50.074 | 80.043 | 46.435 | 84.043 |
| 1621.0 | 53.288 | 76.537 | 50.078 | 80.052 | 46.441 | 84.055 |
| 1622.0 | 53.291 | 76.544 | 50.083 | 80.062 | 46.448 | 84.066 |
| 1623.0 | 53.294 | 76.552 | 50.087 | 80.071 | 46.455 | 84.078 |
| 1624.0 | 53.297 | 76.559 | 50.092 | 80.081 | 46.461 | 84.09 |
| 1625.0 | 53.3 | 76.566 | 50.097 | 80.09 | 46.468 | 84.102 |
| 1626.0 | 53.304 | 76.574 | 50.102 | 80.1 | 46.475 | 84.113 |
| 1627.0 | 53.307 | 76.581 | 50.107 | 80.11 | 46.482 | 84.125 |
| 1628.0 | 53.31 | 76.589 | 50.112 | 80.12 | 46.489 | 84.137 |
| 1629.0 | 53.314 | 76.596 | 50.117 | 80.13 | 46.496 | 84.149 |
| 1630.0 | 53.318 | 76.604 | 50.122 | 80.14 | 46.504 | 84.161 |
| 1631.0 | 53.321 | 76.612 | 50.128 | 80.149 | 46.511 | 84.173 |
| 1632.0 | 53.325 | 76.619 | 50.133 | 80.159 | 46.519 | 84.185 |
| 1633.0 | 53.329 | 76.627 | 50.139 | 80.17 | 46.526 | 84.197 |
| 1634.0 | 53.332 | 76.635 | 50.144 | 80.18 | 46.534 | 84.209 |
| 1635.0 | 53.336 | 76.643 | 50.15 | 80.19 | 46.542 | 84.221 |
| 1636.0 | 53.34 | 76.651 | 50.156 | 80.2 | 46.55 | 84.233 |
| 1637.0 | 53.345 | 76.659 | 50.162 | 80.21 | 46.558 | 84.246 |
| 1638.0 | 53.349 | 76.667 | 50.168 | 80.221 | 46.567 | 84.258 |
| 1639.0 | 53.353 | 76.675 | 50.174 | 80.231 | 46.575 | 84.27 |
| 1640.0 | 53.358 | 76.683 | 50.181 | 80.242 | 46.583 | 84.282 |
| 1641.0 | 53.362 | 76.692 | 50.187 | 80.252 | 46.592 | 84.295 |
| 1642.0 | 53.367 | 76.7 | 50.194 | 80.263 | 46.601 | 84.308 |
| 1643.0 | 53.371 | 76.708 | 50.2 | 80.273 | 46.61 | 84.32 |
| 1644.0 | 53.376 | 76.717 | 50.207 | 80.284 | 46.618 | 84.333 |
| 1645.0 | 53.381 | 76.725 | 50.214 | 80.295 | 46.627 | 84.345 |
| 1646.0 | 53.386 | 76.734 | 50.22 | 80.306 | 46.636 | 84.358 |
| 1647.0 | 53.391 | 76.743 | 50.227 | 80.316 | 46.646 | 84.371 |
| 1648.0 | 53.396 | 76.751 | 50.234 | 80.327 | 46.655 | 84.383 |
| 1649.0 | 53.401 | 76.76 | 50.242 | 80.338 | 46.665 | 84.396 |
| 1650.0 | 53.407 | 76.769 | 50.249 | 80.349 | 46.674 | 84.409 |